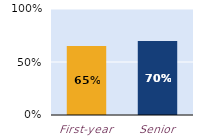
| Category | substantially |
|---|---|
| First-year | 0.652 |
| Senior | 0.699 |